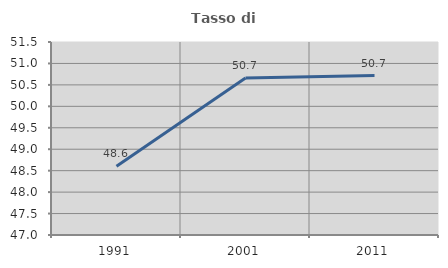
| Category | Tasso di occupazione   |
|---|---|
| 1991.0 | 48.605 |
| 2001.0 | 50.661 |
| 2011.0 | 50.718 |